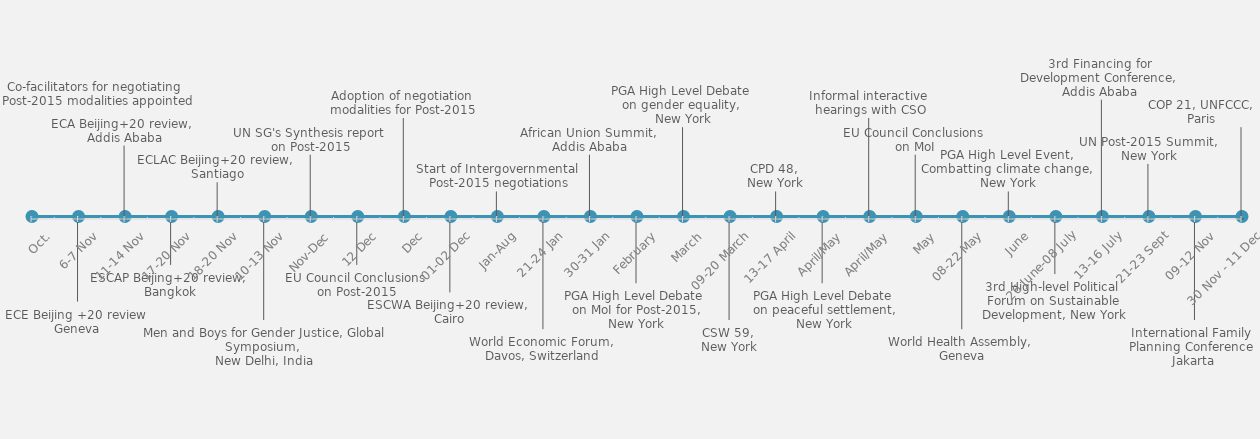
| Category | POSITION |
|---|---|
| Co-facilitators for negotiating Post-2015 modalities appointed | 60 |
| ECE Beijing +20 review Geneva | -45 |
| ECA Beijing+20 review, Addis Ababa | 40 |
| ESCAP Beijing+20 review, Bangkok | -25 |
| ECLAC Beijing+20 review, Santiago | 20 |
| Men and Boys for Gender Justice, Global Symposium, New Delhi, India | -55 |
| UN SG's Synthesis report on Post-2015 | 35 |
| EU Council Conclusions on Post-2015 | -25 |
| Adoption of negotiation modalities for Post-2015 | 55 |
| ESCWA Beijing+20 review, Cairo | -40 |
| Start of Intergovernmental Post-2015 negotiations | 15 |
| World Economic Forum, Davos, Switzerland | -60 |
| African Union Summit, Addis Ababa | 35 |
| PGA High Level Debate on MoI for Post-2015, New York | -35 |
| PGA High Level Debate on gender equality, New York | 50 |
| CSW 59, New York | -55 |
| CPD 48, New York | 15 |
| PGA High Level Debate on peaceful settlement, New York | -35 |
| Informal interactive hearings with CSO | 55 |
| EU Council Conclusions on MoI | 35 |
| World Health Assembly, Geneva | -60 |
| PGA High Level Event, Combatting climate change, New York | 15 |
| 3rd High-level Political Forum on Sustainable Development, New York | -30 |
| 3rd Financing for Development Conference, Addis Ababa  | 65 |
| UN Post-2015 Summit, New York | 30 |
| International Family Planning Conference Jakarta | -55 |
| COP 21, UNFCCC, Paris  | 50 |